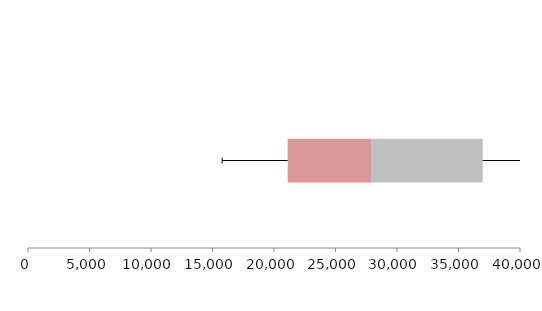
| Category | Series 1 | Series 2 | Series 3 |
|---|---|---|---|
| 0 | 21112.408 | 6780.352 | 9075.988 |